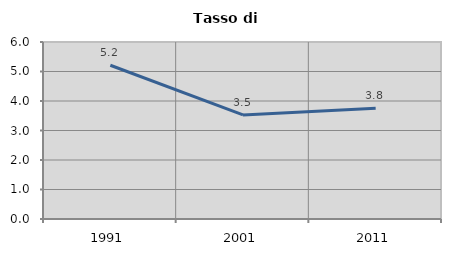
| Category | Tasso di disoccupazione   |
|---|---|
| 1991.0 | 5.211 |
| 2001.0 | 3.526 |
| 2011.0 | 3.756 |